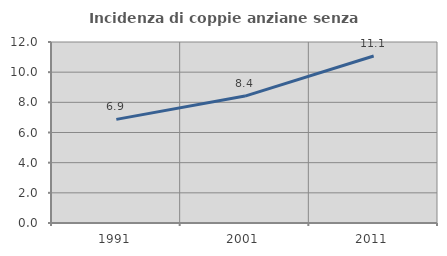
| Category | Incidenza di coppie anziane senza figli  |
|---|---|
| 1991.0 | 6.869 |
| 2001.0 | 8.414 |
| 2011.0 | 11.074 |